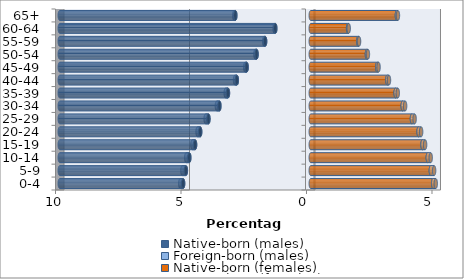
| Category | Native-born (males) | Foreign-born (males) | Native-born (females) | Foreign-born (females) |
|---|---|---|---|---|
| 0-4 | -5.085 | -0.114 | 4.877 | 0.104 |
| 5-9 | -4.975 | -0.141 | 4.785 | 0.131 |
| 10-14 | -4.839 | -0.123 | 4.663 | 0.117 |
| 15-19 | -4.608 | -0.107 | 4.453 | 0.103 |
| 20-24 | -4.405 | -0.105 | 4.296 | 0.102 |
| 25-29 | -4.076 | -0.112 | 4.031 | 0.107 |
| 30-34 | -3.64 | -0.101 | 3.664 | 0.096 |
| 35-39 | -3.298 | -0.091 | 3.382 | 0.086 |
| 40-44 | -2.944 | -0.071 | 3.051 | 0.066 |
| 45-49 | -2.554 | -0.058 | 2.649 | 0.052 |
| 50-54 | -2.158 | -0.046 | 2.238 | 0.04 |
| 55-59 | -1.818 | -0.037 | 1.892 | 0.032 |
| 60-64 | -1.413 | -0.028 | 1.486 | 0.026 |
| 65+ | -3.005 | -0.044 | 3.431 | 0.042 |